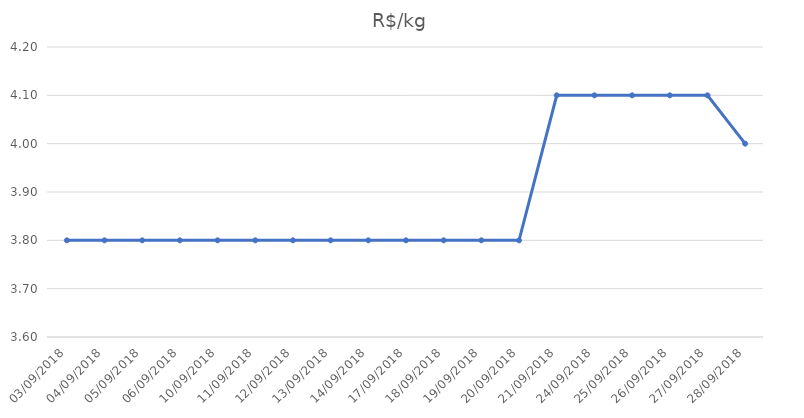
| Category | R$/kg |
|---|---|
| 03/09/2018 | 3.8 |
| 04/09/2018 | 3.8 |
| 05/09/2018 | 3.8 |
| 06/09/2018 | 3.8 |
| 10/09/2018 | 3.8 |
| 11/09/2018 | 3.8 |
| 12/09/2018 | 3.8 |
| 13/09/2018 | 3.8 |
| 14/09/2018 | 3.8 |
| 17/09/2018 | 3.8 |
| 18/09/2018 | 3.8 |
| 19/09/2018 | 3.8 |
| 20/09/2018 | 3.8 |
| 21/09/2018 | 4.1 |
| 24/09/2018 | 4.1 |
| 25/09/2018 | 4.1 |
| 26/09/2018 | 4.1 |
| 27/09/2018 | 4.1 |
| 28/09/2018 | 4 |